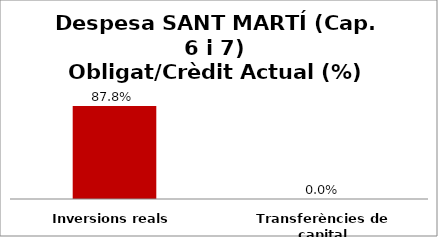
| Category | Series 0 |
|---|---|
| Inversions reals | 0.878 |
| Transferències de capital | 0 |